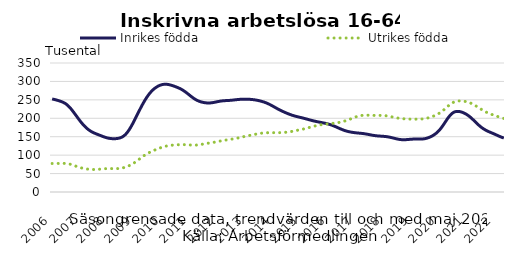
| Category | Inrikes födda | Utrikes födda |
|---|---|---|
| 2006.0 | 252.335 | 77.332 |
| 38749.0 | 251.02 | 77.353 |
| 38777.0 | 249.334 | 77.377 |
| 38808.0 | 247.385 | 77.438 |
| 38838.0 | 245.244 | 77.558 |
| 38869.0 | 242.609 | 77.629 |
| 38899.0 | 238.857 | 77.363 |
| 38930.0 | 233.568 | 76.503 |
| 38961.0 | 226.885 | 75.029 |
| 38991.0 | 219.108 | 73.06 |
| 39022.0 | 210.74 | 70.831 |
| 39052.0 | 202.191 | 68.577 |
| 2007.0 | 193.823 | 66.533 |
| 39114.0 | 186.031 | 64.816 |
| 39142.0 | 179.081 | 63.465 |
| 39173.0 | 173.078 | 62.442 |
| 39203.0 | 168.059 | 61.679 |
| 39234.0 | 163.983 | 61.181 |
| 39264.0 | 160.726 | 60.996 |
| 39295.0 | 158.03 | 61.151 |
| 39326.0 | 155.571 | 61.592 |
| 39356.0 | 153.134 | 62.178 |
| 39387.0 | 150.683 | 62.767 |
| 39417.0 | 148.424 | 63.246 |
| 2008.0 | 146.63 | 63.508 |
| 39479.0 | 145.411 | 63.529 |
| 39508.0 | 144.726 | 63.405 |
| 39539.0 | 144.58 | 63.293 |
| 39569.0 | 144.982 | 63.394 |
| 39600.0 | 146.064 | 63.846 |
| 39630.0 | 148.151 | 64.726 |
| 39661.0 | 151.755 | 66.08 |
| 39692.0 | 157.317 | 67.926 |
| 39722.0 | 165.03 | 70.301 |
| 39753.0 | 174.737 | 73.234 |
| 39783.0 | 185.969 | 76.73 |
| 2009.0 | 198.133 | 80.788 |
| 39845.0 | 210.654 | 85.322 |
| 39873.0 | 223.091 | 90.081 |
| 39904.0 | 235.048 | 94.785 |
| 39934.0 | 246.182 | 99.191 |
| 39965.0 | 256.256 | 103.147 |
| 39995.0 | 265.075 | 106.619 |
| 40026.0 | 272.504 | 109.69 |
| 40057.0 | 278.573 | 112.484 |
| 40087.0 | 283.445 | 115.118 |
| 40118.0 | 287.246 | 117.606 |
| 40148.0 | 290.011 | 119.919 |
| 2010.0 | 291.706 | 121.977 |
| 40210.0 | 292.337 | 123.706 |
| 40238.0 | 291.988 | 125.107 |
| 40269.0 | 290.81 | 126.201 |
| 40299.0 | 289.06 | 127 |
| 40330.0 | 286.938 | 127.573 |
| 40360.0 | 284.575 | 128.003 |
| 40391.0 | 281.949 | 128.312 |
| 40422.0 | 278.859 | 128.487 |
| 40452.0 | 275.104 | 128.495 |
| 40483.0 | 270.667 | 128.319 |
| 40513.0 | 265.782 | 127.992 |
| 2011.0 | 260.79 | 127.587 |
| 40575.0 | 256.028 | 127.264 |
| 40603.0 | 251.818 | 127.211 |
| 40634.0 | 248.372 | 127.57 |
| 40664.0 | 245.736 | 128.356 |
| 40695.0 | 243.837 | 129.431 |
| 40725.0 | 242.542 | 130.596 |
| 40756.0 | 241.764 | 131.71 |
| 40787.0 | 241.554 | 132.73 |
| 40817.0 | 241.931 | 133.694 |
| 40848.0 | 242.842 | 134.695 |
| 40878.0 | 244.093 | 135.803 |
| 2012.0 | 245.387 | 137.037 |
| 40940.0 | 246.513 | 138.315 |
| 40969.0 | 247.328 | 139.523 |
| 41000.0 | 247.836 | 140.587 |
| 41030.0 | 248.175 | 141.526 |
| 41061.0 | 248.547 | 142.441 |
| 41091.0 | 249.081 | 143.422 |
| 41122.0 | 249.789 | 144.52 |
| 41153.0 | 250.522 | 145.762 |
| 41183.0 | 251.133 | 147.131 |
| 41214.0 | 251.559 | 148.567 |
| 41244.0 | 251.777 | 149.982 |
| 2013.0 | 251.834 | 151.324 |
| 41306.0 | 251.692 | 152.608 |
| 41334.0 | 251.319 | 153.886 |
| 41365.0 | 250.737 | 155.191 |
| 41395.0 | 249.912 | 156.501 |
| 41426.0 | 248.804 | 157.74 |
| 41456.0 | 247.415 | 158.846 |
| 41487.0 | 245.762 | 159.765 |
| 41518.0 | 243.813 | 160.418 |
| 41548.0 | 241.502 | 160.78 |
| 41579.0 | 238.73 | 160.908 |
| 41609.0 | 235.526 | 160.916 |
| 2014.0 | 232.05 | 160.909 |
| 41671.0 | 228.512 | 160.929 |
| 41699.0 | 225.083 | 160.988 |
| 41730.0 | 221.838 | 161.12 |
| 41760.0 | 218.817 | 161.381 |
| 41791.0 | 215.995 | 161.828 |
| 41821.0 | 213.339 | 162.491 |
| 41852.0 | 210.845 | 163.372 |
| 41883.0 | 208.594 | 164.458 |
| 41913.0 | 206.631 | 165.675 |
| 41944.0 | 204.93 | 166.923 |
| 41974.0 | 203.401 | 168.154 |
| 2015.0 | 201.902 | 169.414 |
| 42036.0 | 200.331 | 170.789 |
| 42064.0 | 198.671 | 172.335 |
| 42095.0 | 196.946 | 174.025 |
| 42125.0 | 195.231 | 175.782 |
| 42156.0 | 193.613 | 177.511 |
| 42186.0 | 192.126 | 179.117 |
| 42217.0 | 190.755 | 180.528 |
| 42248.0 | 189.48 | 181.723 |
| 42278.0 | 188.26 | 182.722 |
| 42309.0 | 187.022 | 183.572 |
| 42339.0 | 185.654 | 184.32 |
| 2016.0 | 184.032 | 184.992 |
| 42401.0 | 182.089 | 185.65 |
| 42430.0 | 179.791 | 186.365 |
| 42461.0 | 177.18 | 187.189 |
| 42491.0 | 174.382 | 188.173 |
| 42522.0 | 171.591 | 189.366 |
| 42552.0 | 168.995 | 190.837 |
| 42583.0 | 166.728 | 192.619 |
| 42614.0 | 164.84 | 194.707 |
| 42644.0 | 163.316 | 197.042 |
| 42675.0 | 162.115 | 199.516 |
| 42705.0 | 161.192 | 201.969 |
| 2017.0 | 160.46 | 204.2 |
| 42767.0 | 159.828 | 206.034 |
| 42795.0 | 159.207 | 207.342 |
| 42826.0 | 158.485 | 208.111 |
| 42856.0 | 157.557 | 208.406 |
| 42887.0 | 156.426 | 208.364 |
| 42917.0 | 155.201 | 208.144 |
| 42948.0 | 154.04 | 207.922 |
| 42979.0 | 153.066 | 207.804 |
| 43009.0 | 152.323 | 207.785 |
| 43040.0 | 151.79 | 207.788 |
| 43070.0 | 151.362 | 207.698 |
| 2018.0 | 150.905 | 207.403 |
| 43132.0 | 150.26 | 206.777 |
| 43160.0 | 149.269 | 205.759 |
| 43191.0 | 147.943 | 204.45 |
| 43221.0 | 146.42 | 203.043 |
| 43252.0 | 144.854 | 201.712 |
| 43282.0 | 143.448 | 200.565 |
| 43313.0 | 142.414 | 199.641 |
| 43344.0 | 141.874 | 198.92 |
| 43374.0 | 141.856 | 198.393 |
| 43405.0 | 142.227 | 198.027 |
| 43435.0 | 142.766 | 197.774 |
| 2019.0 | 143.283 | 197.624 |
| 43497.0 | 143.636 | 197.595 |
| 43525.0 | 143.746 | 197.667 |
| 43556.0 | 143.684 | 197.801 |
| 43586.0 | 143.667 | 198.021 |
| 43617.0 | 144.029 | 198.487 |
| 43647.0 | 145.037 | 199.409 |
| 43678.0 | 146.785 | 200.821 |
| 43709.0 | 149.256 | 202.652 |
| 43739.0 | 152.406 | 204.822 |
| 43770.0 | 156.347 | 207.308 |
| 43800.0 | 161.352 | 210.227 |
| 2020.0 | 167.679 | 213.76 |
| 43862.0 | 175.402 | 218.021 |
| 43891.0 | 184.345 | 223.048 |
| 43922.0 | 193.789 | 228.598 |
| 43952.0 | 202.681 | 234.155 |
| 43983.0 | 210.061 | 239.125 |
| 44013.0 | 215.236 | 242.96 |
| 44044.0 | 218.021 | 245.461 |
| 44075.0 | 218.755 | 246.773 |
| 44105.0 | 217.981 | 247.136 |
| 44136.0 | 216.129 | 246.808 |
| 44166.0 | 213.401 | 245.955 |
| 2021.0 | 209.814 | 244.578 |
| 44228.0 | 205.348 | 242.626 |
| 44256.0 | 200.018 | 240.017 |
| 44287.0 | 194.076 | 236.769 |
| 44317.0 | 187.968 | 233.068 |
| 44348.0 | 182.038 | 229.089 |
| 44378.0 | 176.667 | 225.081 |
| 44409.0 | 172.098 | 221.284 |
| 44440.0 | 168.288 | 217.814 |
| 44470.0 | 165.079 | 214.762 |
| 44501.0 | 162.278 | 212.147 |
| 44531.0 | 159.651 | 209.859 |
| 2022.0 | 156.955 | 207.695 |
| 44593.0 | 154.117 | 205.511 |
| 44621.0 | 151.284 | 203.332 |
| 44652.0 | 148.697 | 201.314 |
| 44682.0 | 146.508 | 199.627 |